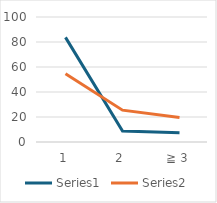
| Category | Series 0 | Series 1 |
|---|---|---|
| 1 | 83.706 | 54.561 |
| 2 | 8.85 | 25.468 |
| ≧ 3 | 7.444 | 19.671 |